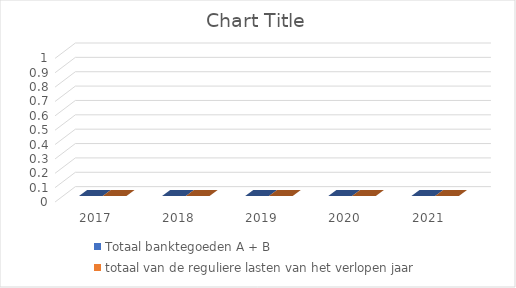
| Category | Totaal banktegoeden A + B | totaal van de reguliere lasten van het verlopen jaar |
|---|---|---|
| 2017 | 0 | 0 |
| 2018 | 0 | 0 |
| 2019 | 0 | 0 |
| 2020 | 0 | 0 |
| 2021 | 0 | 0 |